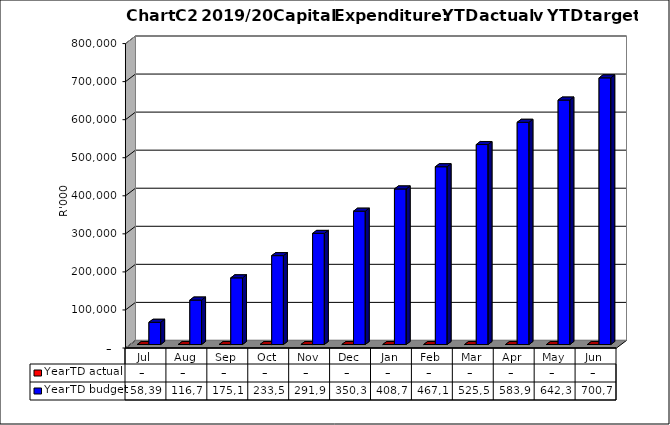
| Category | YearTD actual | YearTD budget |
|---|---|---|
| Jul | 0 | 58394184.533 |
| Aug | 0 | 116788369.067 |
| Sep | 0 | 175182553.6 |
| Oct | 0 | 233576738.133 |
| Nov | 0 | 291970922.667 |
| Dec | 0 | 350365107.2 |
| Jan | 0 | 408759291.733 |
| Feb | 0 | 467153476.267 |
| Mar | 0 | 525547660.8 |
| Apr | 0 | 583941845.333 |
| May | 0 | 642336029.867 |
| Jun | 0 | 700730214.4 |